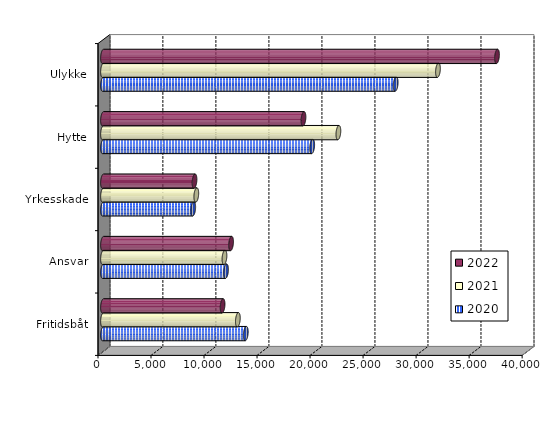
| Category | 2020 | 2021 | 2022 |
|---|---|---|---|
| Fritidsbåt | 13466 | 12717.946 | 11276.932 |
| Ansvar | 11603.98 | 11455.784 | 12078.237 |
| Yrkesskade | 8509.779 | 8798.661 | 8629.697 |
| Hytte | 19730 | 22199 | 18907.302 |
| Ulykke | 27600.997 | 31589.073 | 37157.663 |